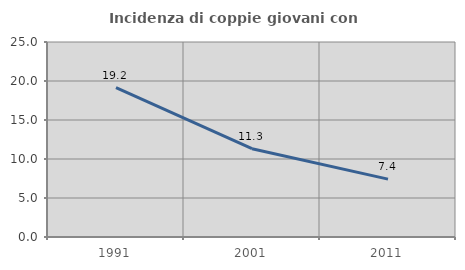
| Category | Incidenza di coppie giovani con figli |
|---|---|
| 1991.0 | 19.157 |
| 2001.0 | 11.318 |
| 2011.0 | 7.423 |